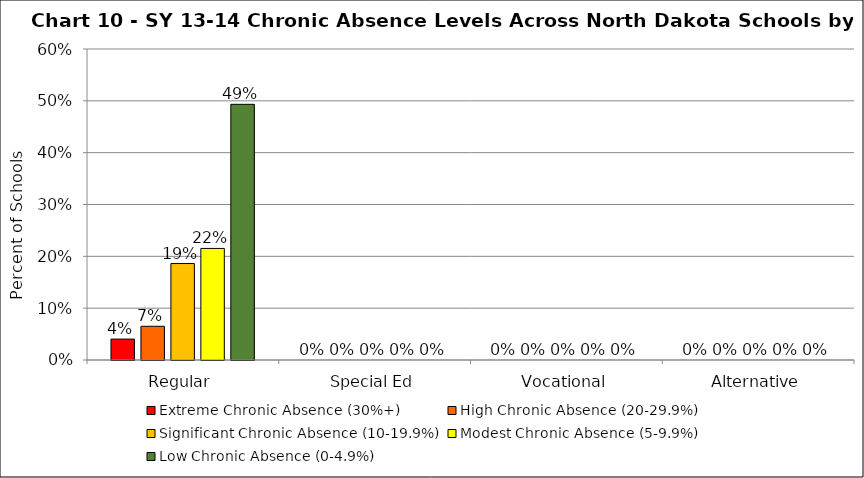
| Category | Extreme Chronic Absence (30%+) | High Chronic Absence (20-29.9%) | Significant Chronic Absence (10-19.9%) | Modest Chronic Absence (5-9.9%) | Low Chronic Absence (0-4.9%) |
|---|---|---|---|---|---|
| 0 | 0.04 | 0.065 | 0.186 | 0.215 | 0.493 |
| 1 | 0 | 0 | 0 | 0 | 0 |
| 2 | 0 | 0 | 0 | 0 | 0 |
| 3 | 0 | 0 | 0 | 0 | 0 |